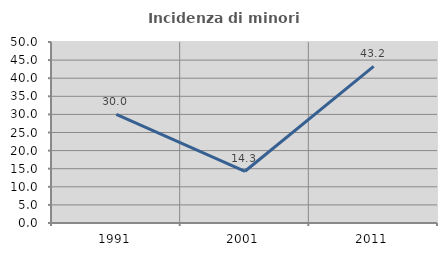
| Category | Incidenza di minori stranieri |
|---|---|
| 1991.0 | 30 |
| 2001.0 | 14.286 |
| 2011.0 | 43.243 |